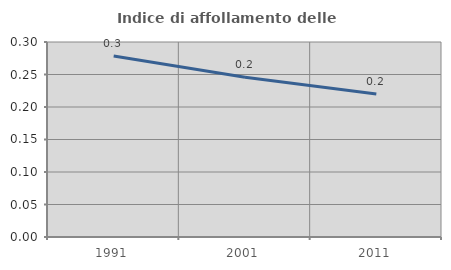
| Category | Indice di affollamento delle abitazioni  |
|---|---|
| 1991.0 | 0.279 |
| 2001.0 | 0.246 |
| 2011.0 | 0.22 |